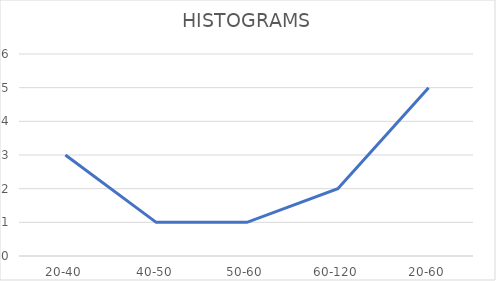
| Category | Series 0 |
|---|---|
| 20-40 | 3 |
| 40-50 | 1 |
| 50-60 | 1 |
| 60-120 | 2 |
| 20-60 | 5 |